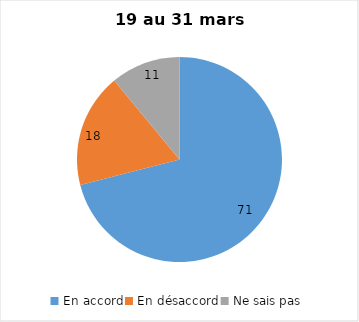
| Category | Series 0 |
|---|---|
| En accord | 71 |
| En désaccord | 18 |
| Ne sais pas | 11 |